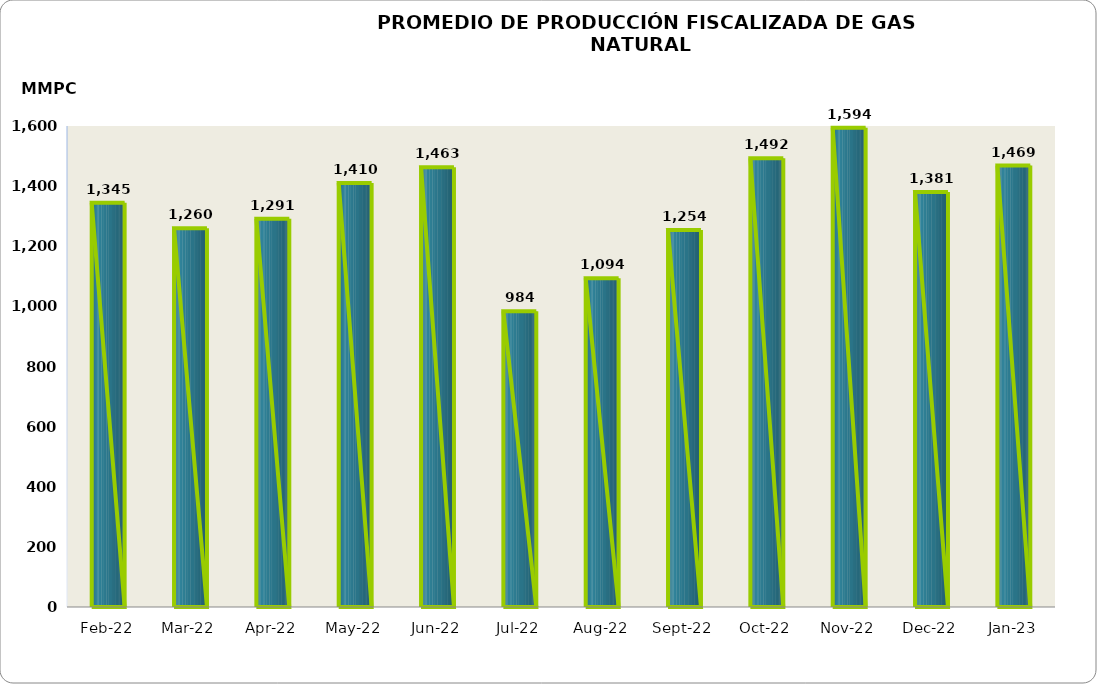
| Category | Series 0 |
|---|---|
| 2022-02-01 | 1344504.622 |
| 2022-03-01 | 1259914.198 |
| 2022-04-01 | 1291170.944 |
| 2022-05-01 | 1410361.644 |
| 2022-06-01 | 1462840.082 |
| 2022-07-01 | 983913.442 |
| 2022-08-01 | 1093528.82 |
| 2022-09-01 | 1253987.9 |
| 2022-10-01 | 1492396.38 |
| 2022-11-01 | 1593827.373 |
| 2022-12-01 | 1380789.661 |
| 2023-01-01 | 1468521.708 |